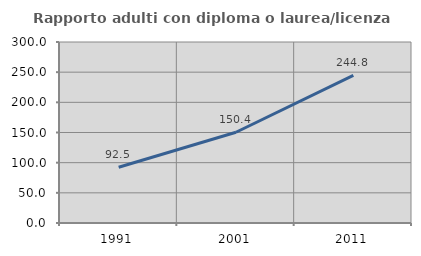
| Category | Rapporto adulti con diploma o laurea/licenza media  |
|---|---|
| 1991.0 | 92.458 |
| 2001.0 | 150.417 |
| 2011.0 | 244.808 |